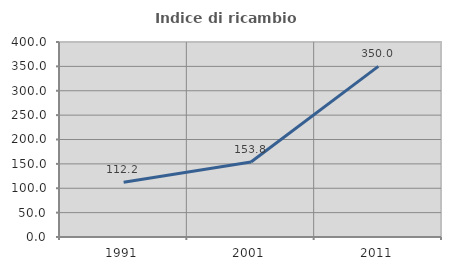
| Category | Indice di ricambio occupazionale  |
|---|---|
| 1991.0 | 112.195 |
| 2001.0 | 153.846 |
| 2011.0 | 350 |